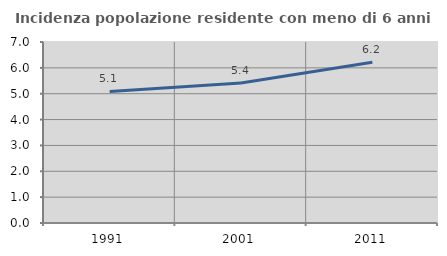
| Category | Incidenza popolazione residente con meno di 6 anni |
|---|---|
| 1991.0 | 5.087 |
| 2001.0 | 5.416 |
| 2011.0 | 6.214 |